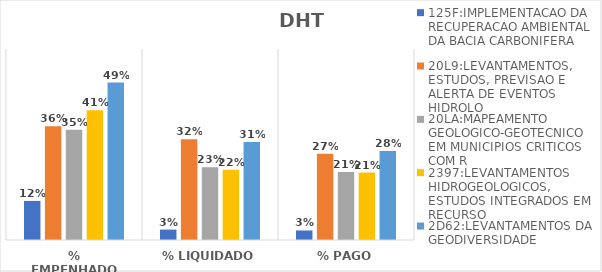
| Category | 125F:IMPLEMENTACAO DA RECUPERACAO AMBIENTAL DA BACIA CARBONIFERA | 20L9:LEVANTAMENTOS, ESTUDOS, PREVISAO E ALERTA DE EVENTOS HIDROLO | 20LA:MAPEAMENTO GEOLOGICO-GEOTECNICO EM MUNICIPIOS CRITICOS COM R | 2397:LEVANTAMENTOS HIDROGEOLOGICOS, ESTUDOS INTEGRADOS EM RECURSO | 2D62:LEVANTAMENTOS DA GEODIVERSIDADE |
|---|---|---|---|---|---|
| % EMPENHADO | 0.123 | 0.357 | 0.346 | 0.407 | 0.495 |
| % LIQUIDADO | 0.033 | 0.316 | 0.229 | 0.221 | 0.308 |
| % PAGO | 0.03 | 0.271 | 0.214 | 0.212 | 0.28 |